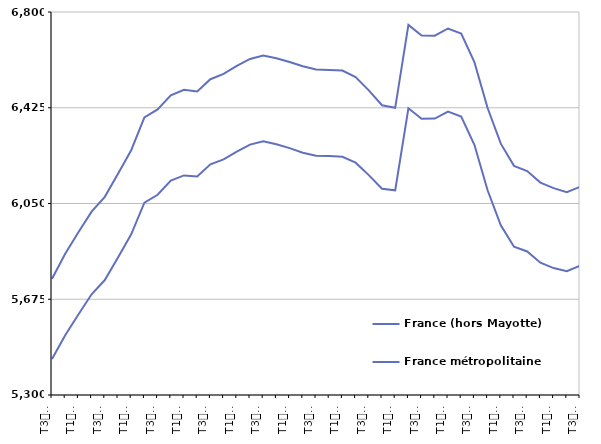
| Category | France (hors Mayotte) | France métropolitaine |
|---|---|---|
| T3
2013 | 5755.1 | 5441.1 |
| T4
2013 | 5853.1 | 5533.8 |
| T1
2014 | 5937.5 | 5615.5 |
| T2
2014 | 6018.1 | 5694.5 |
| T3
2014 | 6076 | 5750.2 |
| T4
2014 | 6166.1 | 5838.8 |
| T1
2015 | 6258.7 | 5929.3 |
| T2
2015 | 6386.9 | 6053.4 |
| T3
2015 | 6418.5 | 6084.3 |
| T4
2015 | 6474 | 6139.8 |
| T1
2016 | 6495.5 | 6160 |
| T2
2016 | 6488.7 | 6156.1 |
| T3
2016 | 6536.7 | 6203.6 |
| T4
2016 | 6557.4 | 6222.6 |
| T1
2017 | 6588.9 | 6252.7 |
| T2
2017 | 6616.1 | 6280.5 |
| T3
2017 | 6629.5 | 6293.9 |
| T4
2017 | 6618.6 | 6281.7 |
| T1
2018 | 6604.1 | 6266.8 |
| T2
2018 | 6587.4 | 6249 |
| T3
2018 | 6574.5 | 6237.1 |
| T4
2018 | 6573.2 | 6235.6 |
| T1
2019 | 6570.9 | 6232.7 |
| T2
2019 | 6545 | 6209.8 |
| T3
2019 | 6493.3 | 6161.2 |
| T4
2019 | 6434.9 | 6107.7 |
| T1
2020 | 6424.8 | 6101.7 |
| T2
2020 | 6749.3 | 6423 |
| T3
2020 | 6708.1 | 6381.6 |
| T4
2020 | 6707.4 | 6382.5 |
| T1
2021 | 6735.4 | 6409.6 |
| T2
2021 | 6715.9 | 6390.5 |
| T3
2021 | 6603.7 | 6279.8 |
| T4
2021 | 6424.1 | 6101.7 |
| T1
2022 | 6284.4 | 5964.6 |
| T2
2022 | 6197.4 | 5881 |
| T3
2022 | 6177.3 | 5862.1 |
| T4
2022 | 6132 | 5818.3 |
| T1
2023 | 6110.1 | 5797.1 |
| T2
2023 | 6093.9 | 5784.6 |
| T3
2023 | 6115.2 | 5806.3 |